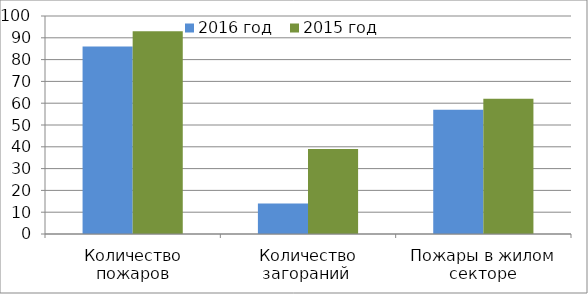
| Category | 2016 год | 2015 год |
|---|---|---|
| Количество пожаров | 86 | 93 |
| Количество загораний  | 14 | 39 |
| Пожары в жилом секторе | 57 | 62 |